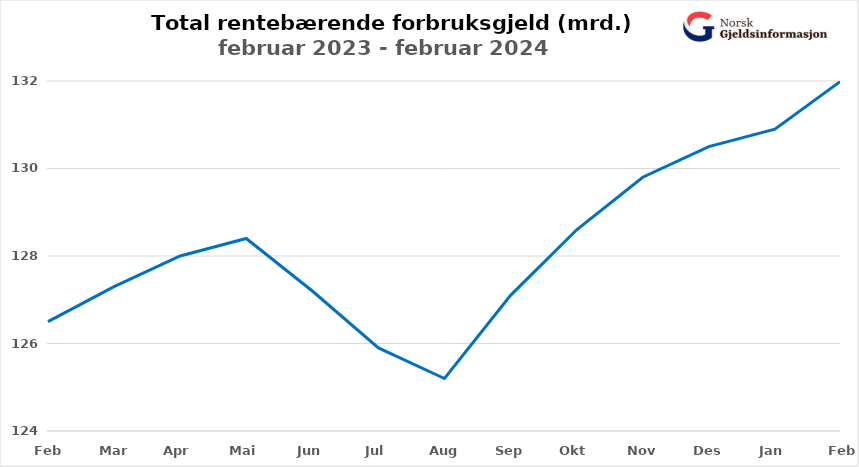
| Category | Rentebærende forbruksgjeld |
|---|---|
| Feb | 126.5 |
| Mar | 127.3 |
| Apr | 128 |
| Mai | 128.4 |
| Jun | 127.2 |
| Jul | 125.9 |
| Aug | 125.2 |
| Sep | 127.1 |
| Okt | 128.6 |
| Nov | 129.8 |
| Des | 130.5 |
| Jan | 130.9 |
| Feb | 132 |